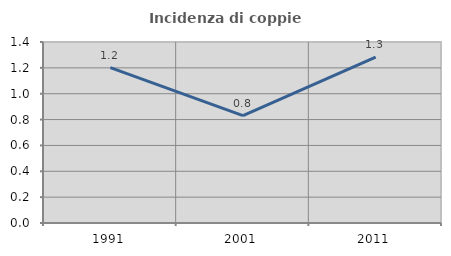
| Category | Incidenza di coppie miste |
|---|---|
| 1991.0 | 1.202 |
| 2001.0 | 0.83 |
| 2011.0 | 1.283 |